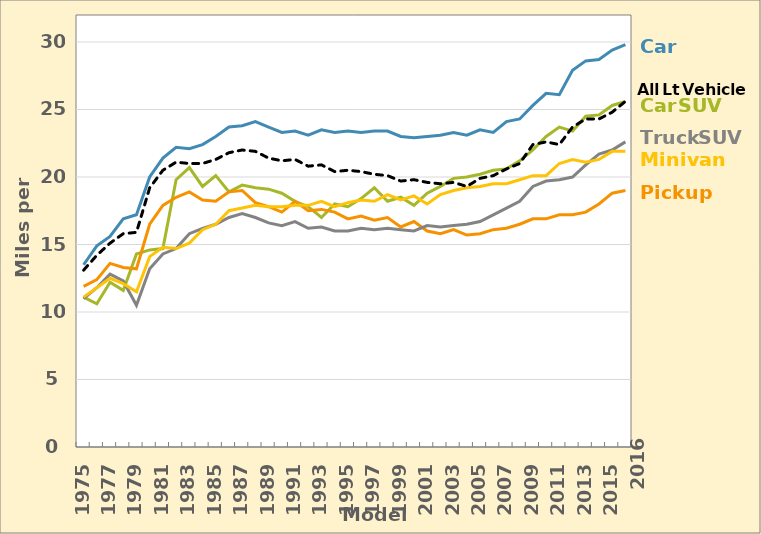
| Category | Car | Car SUV | Pickup | Truck SUV | Minivan/van | All Light Vehicles |
|---|---|---|---|---|---|---|
| 1975.0 | 13.5 | 11.1 | 11.9 | 11 | 11.1 | 13.1 |
| 1976.0 | 14.9 | 10.6 | 12.4 | 11.8 | 11.8 | 14.2 |
| 1977.0 | 15.6 | 12.2 | 13.6 | 12.8 | 12.5 | 15.1 |
| 1978.0 | 16.9 | 11.6 | 13.3 | 12.3 | 12.1 | 15.8 |
| 1979.0 | 17.2 | 14.3 | 13.2 | 10.5 | 11.5 | 15.9 |
| 1980.0 | 20 | 14.6 | 16.5 | 13.2 | 14.1 | 19.2 |
| 1981.0 | 21.4 | 14.7 | 17.9 | 14.3 | 14.8 | 20.5 |
| 1982.0 | 22.2 | 19.8 | 18.5 | 14.7 | 14.7 | 21.1 |
| 1983.0 | 22.1 | 20.7 | 18.9 | 15.8 | 15.1 | 21 |
| 1984.0 | 22.4 | 19.3 | 18.3 | 16.2 | 16.1 | 21 |
| 1985.0 | 23 | 20.1 | 18.2 | 16.5 | 16.5 | 21.3 |
| 1986.0 | 23.7 | 18.9 | 18.9 | 17 | 17.5 | 21.8 |
| 1987.0 | 23.8 | 19.4 | 19 | 17.3 | 17.7 | 22 |
| 1988.0 | 24.1 | 19.2 | 18.1 | 17 | 17.9 | 21.9 |
| 1989.0 | 23.7 | 19.1 | 17.8 | 16.6 | 17.8 | 21.4 |
| 1990.0 | 23.3 | 18.8 | 17.4 | 16.4 | 17.8 | 21.2 |
| 1991.0 | 23.4 | 18.2 | 18.2 | 16.7 | 17.9 | 21.3 |
| 1992.0 | 23.1 | 17.8 | 17.5 | 16.2 | 17.9 | 20.8 |
| 1993.0 | 23.5 | 17 | 17.6 | 16.3 | 18.2 | 20.9 |
| 1994.0 | 23.3 | 18 | 17.4 | 16 | 17.8 | 20.4 |
| 1995.0 | 23.4 | 17.8 | 16.9 | 16 | 18.1 | 20.5 |
| 1996.0 | 23.3 | 18.4 | 17.1 | 16.2 | 18.3 | 20.4 |
| 1997.0 | 23.4 | 19.2 | 16.8 | 16.1 | 18.2 | 20.2 |
| 1998.0 | 23.4 | 18.2 | 17 | 16.2 | 18.7 | 20.1 |
| 1999.0 | 23 | 18.5 | 16.3 | 16.1 | 18.3 | 19.7 |
| 2000.0 | 22.9 | 17.9 | 16.7 | 16 | 18.6 | 19.8 |
| 2001.0 | 23 | 18.8 | 16 | 16.4 | 18 | 19.6 |
| 2002.0 | 23.1 | 19.3 | 15.8 | 16.3 | 18.7 | 19.5 |
| 2003.0 | 23.3 | 19.9 | 16.1 | 16.4 | 19 | 19.6 |
| 2004.0 | 23.1 | 20 | 15.7 | 16.5 | 19.2 | 19.3 |
| 2005.0 | 23.5 | 20.2 | 15.8 | 16.7 | 19.3 | 19.9 |
| 2006.0 | 23.3 | 20.5 | 16.1 | 17.2 | 19.5 | 20.1 |
| 2007.0 | 24.1 | 20.6 | 16.2 | 17.7 | 19.5 | 20.6 |
| 2008.0 | 24.3 | 21.2 | 16.5 | 18.2 | 19.8 | 21 |
| 2009.0 | 25.3 | 22 | 16.9 | 19.3 | 20.1 | 22.4 |
| 2010.0 | 26.2 | 23 | 16.9 | 19.7 | 20.1 | 22.6 |
| 2011.0 | 26.1 | 23.7 | 17.2 | 19.8 | 21 | 22.4 |
| 2012.0 | 27.9 | 23.4 | 17.2 | 20 | 21.3 | 23.7 |
| 2013.0 | 28.6 | 24.5 | 17.4 | 20.9 | 21.1 | 24.3 |
| 2014.0 | 28.7 | 24.6 | 18 | 21.7 | 21.3 | 24.3 |
| 2015.0 | 29.4 | 25.3 | 18.8 | 22 | 21.9 | 24.8 |
| 2016.0 | 29.8 | 25.6 | 19 | 22.6 | 21.9 | 25.6 |